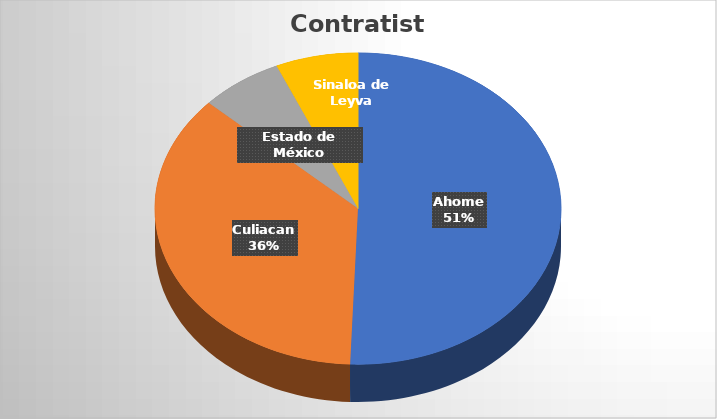
| Category | Suma  |
|---|---|
| Ahome | 16856764.96 |
| Culiacan | 12075135.32 |
| Estado de México | 2185384.92 |
| Sinaloa de Leyva | 2185317.84 |